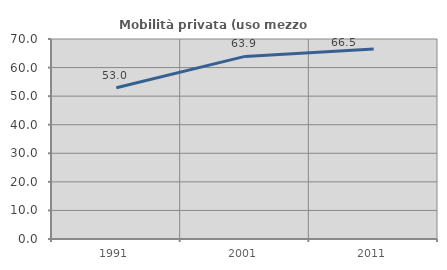
| Category | Mobilità privata (uso mezzo privato) |
|---|---|
| 1991.0 | 52.953 |
| 2001.0 | 63.916 |
| 2011.0 | 66.476 |